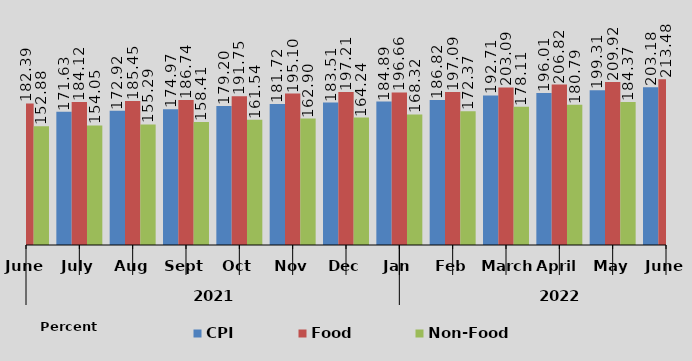
| Category | CPI | Food | Non-Food |
|---|---|---|---|
| 0 | 170.133 | 182.392 | 152.881 |
| 1 | 171.63 | 184.121 | 154.053 |
| 2 | 172.922 | 185.454 | 155.287 |
| 3 | 174.974 | 186.742 | 158.414 |
| 4 | 179.205 | 191.755 | 161.543 |
| 5 | 181.722 | 195.096 | 162.9 |
| 6 | 183.513 | 197.209 | 164.24 |
| 7 | 184.886 | 196.659 | 168.316 |
| 8 | 186.822 | 197.094 | 172.366 |
| 9 | 192.711 | 203.087 | 178.111 |
| 10 | 196.01 | 206.824 | 180.79 |
| 11 | 199.307 | 209.92 | 184.373 |
| 12 | 203.178 | 213.476 | 188.685 |